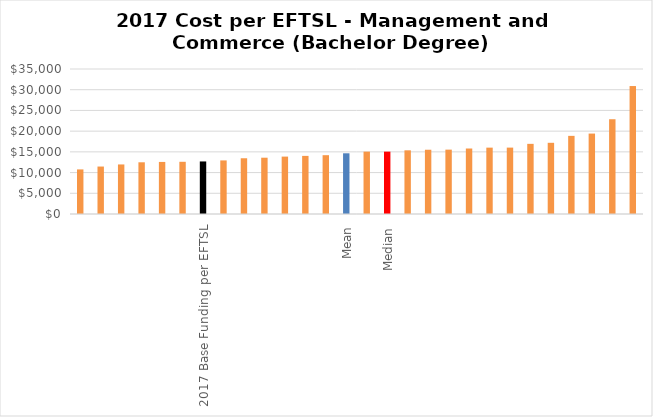
| Category | Series 0 |
|---|---|
|  | 10763.651 |
|  | 11456.241 |
|  | 11961.872 |
|  | 12481.066 |
|  | 12566.245 |
|  | 12601.27 |
| 2017 Base Funding per EFTSL | 12685 |
|  | 12934.476 |
|  | 13456.386 |
|  | 13589.094 |
|  | 13855.762 |
|  | 14026.029 |
|  | 14197.397 |
| Mean | 14652.274 |
|  | 15054.404 |
| Median | 15054.404 |